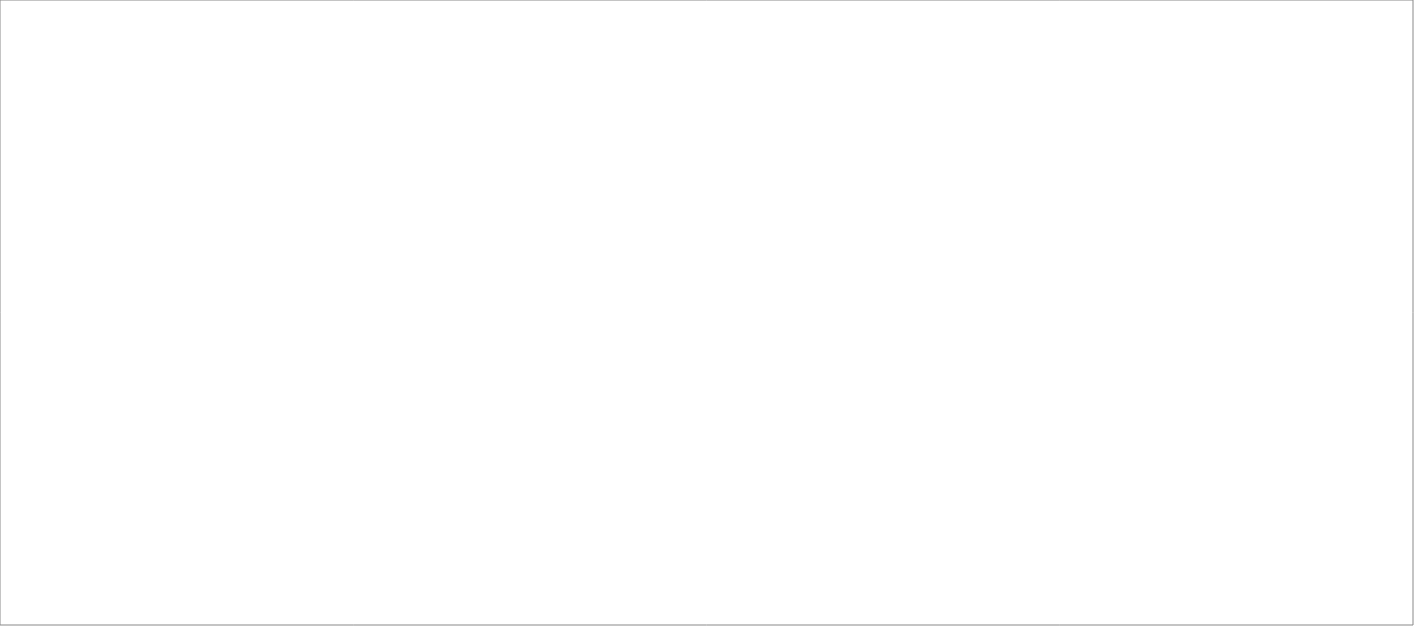
| Category | Total |
|---|---|
| Poolia Sverige AB | 85 |
| Clockwork Bemanning & Rekrytering AB | 85 |
| Randstad AB | 76.6 |
| Wise Professionals AB | 65 |
| Experis AB | 46.5 |